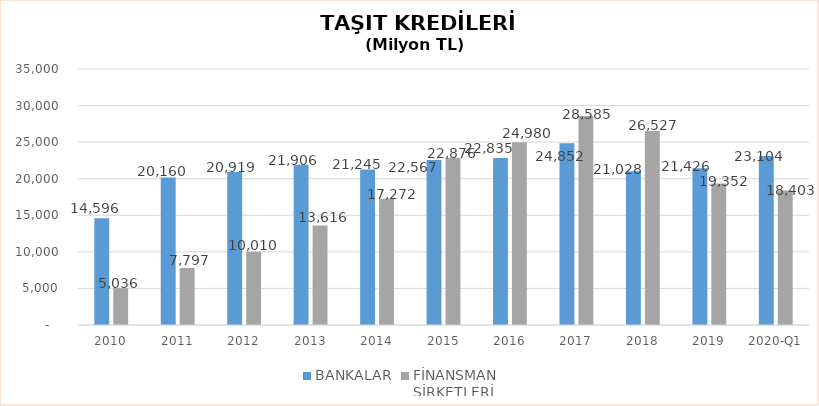
| Category | BANKALAR | FİNANSMAN 
ŞİRKETLERİ |
|---|---|---|
| 2010 | 14596 | 5035.89 |
| 2011 | 20160 | 7796.854 |
| 2012 | 20919 | 10009.755 |
| 2013 | 21906 | 13616.036 |
| 2014 | 21245 | 17271.844 |
| 2015 | 22567 | 22875.563 |
| 2016 | 22835 | 24980.231 |
| 2017 | 24852 | 28584.938 |
| 2018 | 21028 | 26527.133 |
| 2019 | 21426.2 | 19352.327 |
| 2020-Q1 | 23104.3 | 18402.91 |